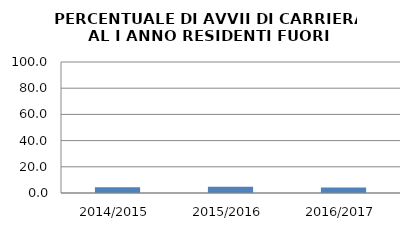
| Category | 2014/2015 2015/2016 2016/2017 |
|---|---|
| 2014/2015 | 4.396 |
| 2015/2016 | 4.706 |
| 2016/2017 | 4.211 |